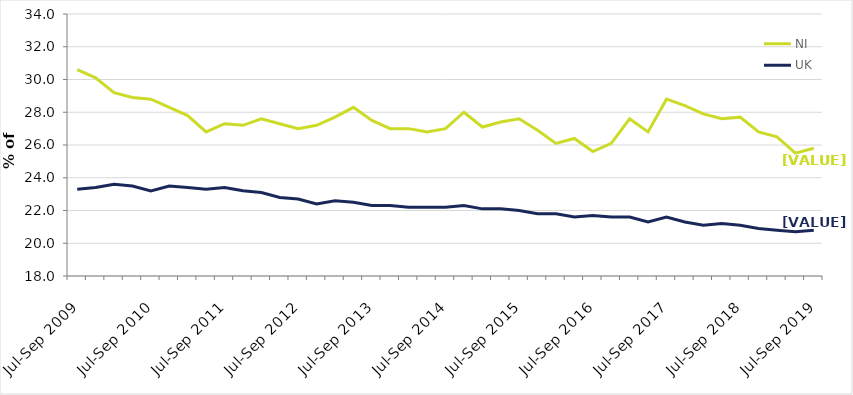
| Category | NI | UK |
|---|---|---|
| Jul-Sep 2009 | 30.6 | 23.3 |
| Oct-Dec 2009 | 30.1 | 23.4 |
| Jan-Mar 2010 | 29.2 | 23.6 |
| Apr-Jun 2010 | 28.9 | 23.5 |
| Jul-Sep 2010 | 28.8 | 23.2 |
| Oct-Dec 2010 | 28.3 | 23.5 |
| Jan-Mar 2011 | 27.8 | 23.4 |
| Apr-Jun 2011 | 26.8 | 23.3 |
| Jul-Sep 2011 | 27.3 | 23.4 |
| Oct-Dec 2011 | 27.2 | 23.2 |
| Jan-Mar 2012 | 27.6 | 23.1 |
| Apr-Jun 2012 | 27.3 | 22.8 |
| Jul-Sep 2012 | 27 | 22.7 |
| Oct-Dec 2012 | 27.2 | 22.4 |
| Jan-Mar 2013 | 27.7 | 22.6 |
| Apr-Jun 2013 | 28.3 | 22.5 |
| Jul-Sep 2013 | 27.5 | 22.3 |
| Oct-Dec 2013 | 27 | 22.3 |
| Jan-Mar 2014 | 27 | 22.2 |
| Apr-Jun 2014 | 26.8 | 22.2 |
| Jul-Sep 2014 | 27 | 22.2 |
| Oct-Dec 2014 | 28 | 22.3 |
| Jan-Mar 2015 | 27.1 | 22.1 |
| Apr-Jun 2015 | 27.4 | 22.1 |
| Jul-Sep 2015 | 27.6 | 22 |
| Oct-Dec 2015 | 26.9 | 21.8 |
| Jan-Mar 2016 | 26.1 | 21.8 |
| Apr-Jun 2016 | 26.4 | 21.6 |
| Jul-Sep 2016 | 25.6 | 21.7 |
| Oct-Dec 2016 | 26.1 | 21.6 |
| Jan-Mar 2017 | 27.6 | 21.6 |
| Apr-Jun 2017 | 26.8 | 21.3 |
| Jul-Sep 2017 | 28.8 | 21.6 |
| Oct-Dec 2017 | 28.4 | 21.3 |
| Jan-Mar 2018 | 27.9 | 21.1 |
| Apr-Jun 2018 | 27.6 | 21.2 |
| Jul-Sep 2018 | 27.7 | 21.1 |
| Oct-Dec 2018 | 26.8 | 20.9 |
| Jan-Mar 2019 | 26.5 | 20.8 |
| Apr-Jun 2019 | 25.5 | 20.7 |
| Jul-Sep 2019 | 25.8 | 20.8 |